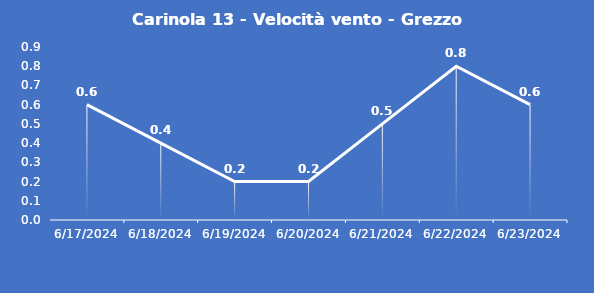
| Category | Carinola 13 - Velocità vento - Grezzo (m/s) |
|---|---|
| 6/17/24 | 0.6 |
| 6/18/24 | 0.4 |
| 6/19/24 | 0.2 |
| 6/20/24 | 0.2 |
| 6/21/24 | 0.5 |
| 6/22/24 | 0.8 |
| 6/23/24 | 0.6 |